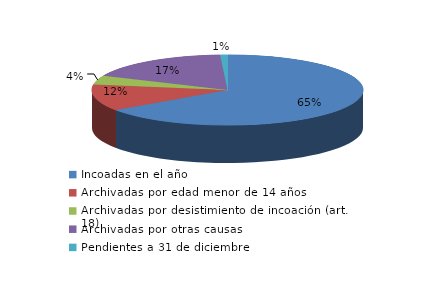
| Category | Series 0 |
|---|---|
| Incoadas en el año | 600 |
| Archivadas por edad menor de 14 años | 112 |
| Archivadas por desistimiento de incoación (art. 18) | 38 |
| Archivadas por otras causas | 160 |
| Pendientes a 31 de diciembre | 8 |